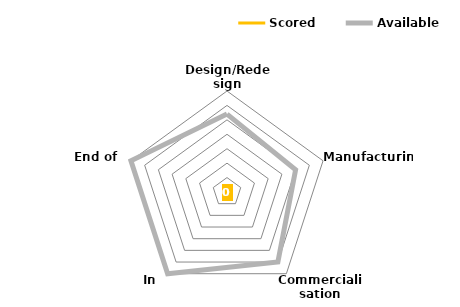
| Category | Scored | Available |
|---|---|---|
| Design/Redesign | 0 | 27 |
| Manufacturing | 0 | 25 |
| Commercialisation | 0 | 30 |
| In Use | 0 | 35 |
| End of Use | 0 | 35 |